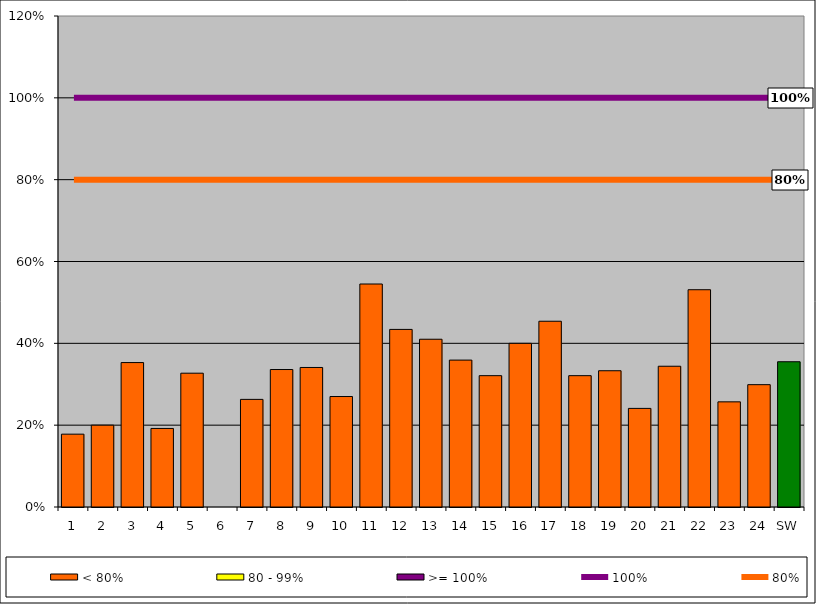
| Category | < 80% | 80 - 99% | >= 100% |
|---|---|---|---|
| 1 | 0.178 | 0 | 0 |
| 2 | 0.2 | 0 | 0 |
| 3 | 0.353 | 0 | 0 |
| 4 | 0.192 | 0 | 0 |
| 5 | 0.327 | 0 | 0 |
| 6 | 0 | 0 | 0 |
| 7 | 0.263 | 0 | 0 |
| 8 | 0.336 | 0 | 0 |
| 9 | 0.341 | 0 | 0 |
| 10 | 0.27 | 0 | 0 |
| 11 | 0.545 | 0 | 0 |
| 12 | 0.434 | 0 | 0 |
| 13 | 0.41 | 0 | 0 |
| 14 | 0.359 | 0 | 0 |
| 15 | 0.321 | 0 | 0 |
| 16 | 0.4 | 0 | 0 |
| 17 | 0.454 | 0 | 0 |
| 18 | 0.321 | 0 | 0 |
| 19 | 0.333 | 0 | 0 |
| 20 | 0.241 | 0 | 0 |
| 21 | 0.344 | 0 | 0 |
| 22 | 0.531 | 0 | 0 |
| 23 | 0.257 | 0 | 0 |
| 24 | 0.299 | 0 | 0 |
| SW | 0.355 | 0 | 0 |